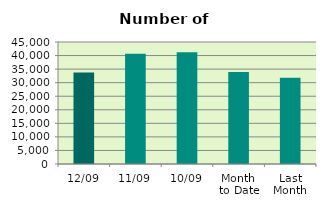
| Category | Series 0 |
|---|---|
| 12/09 | 33718 |
| 11/09 | 40654 |
| 10/09 | 41196 |
| Month 
to Date | 33931.556 |
| Last
Month | 31813.182 |